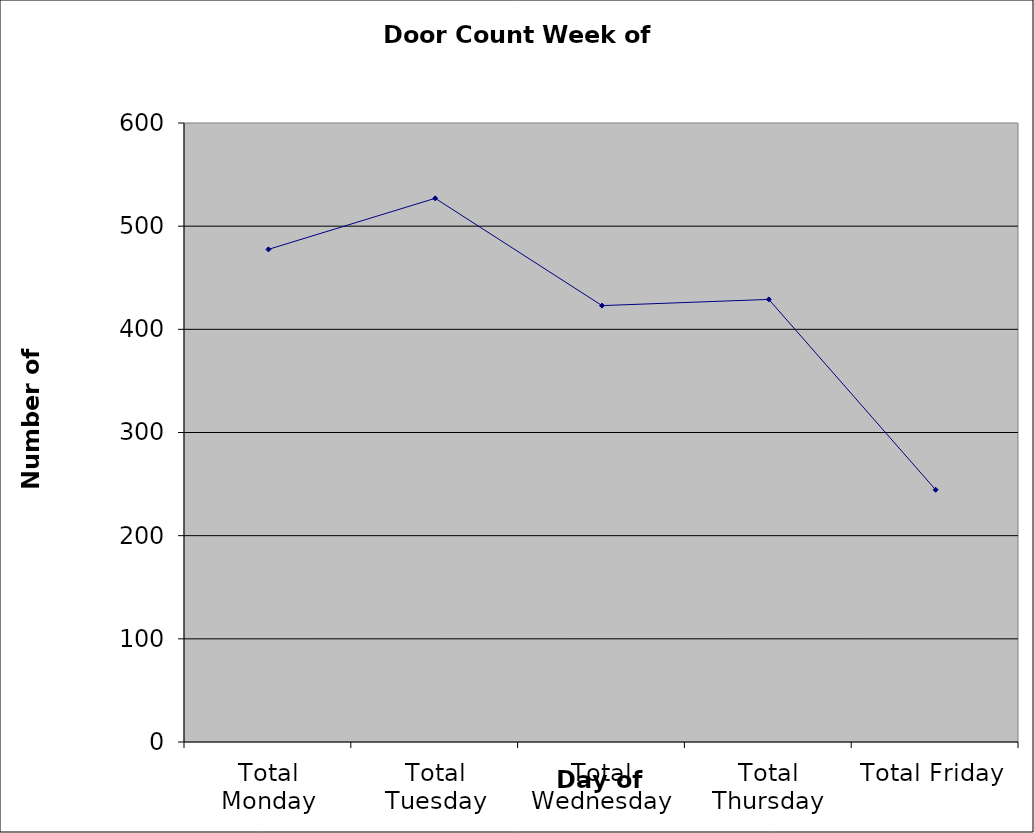
| Category | Series 0 |
|---|---|
| Total Monday | 477.5 |
| Total Tuesday | 527 |
| Total Wednesday | 423 |
| Total Thursday | 429 |
| Total Friday | 244.5 |